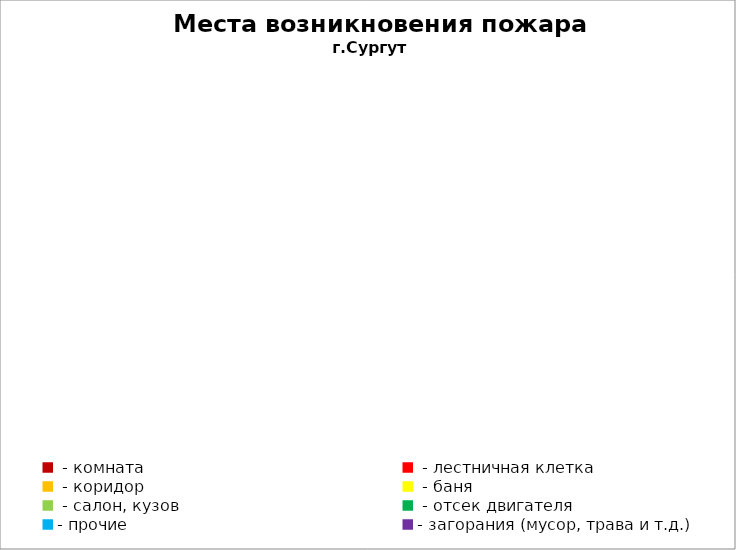
| Category | Места возникновения пожара |
|---|---|
|  - комната | 0 |
|  - лестничная клетка | 1 |
|  - коридор | 0 |
|  - баня | 0 |
|  - салон, кузов | 2 |
|  - отсек двигателя | 3 |
| - прочие | 5 |
| - загорания (мусор, трава и т.д.)  | 1 |